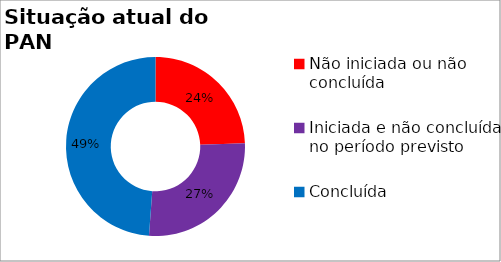
| Category | Series 0 |
|---|---|
| Não iniciada ou não concluída | 0.244 |
| Iniciada e não concluída no período previsto | 0.267 |
| Concluída | 0.488 |